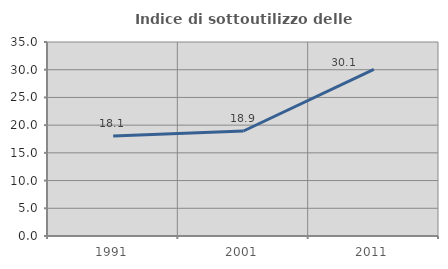
| Category | Indice di sottoutilizzo delle abitazioni  |
|---|---|
| 1991.0 | 18.052 |
| 2001.0 | 18.944 |
| 2011.0 | 30.075 |